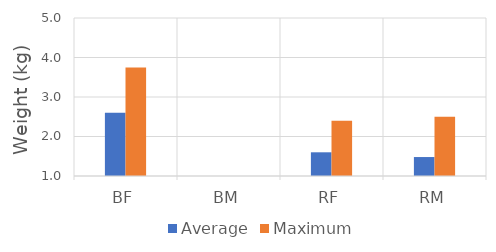
| Category | Average | Maximum |
|---|---|---|
| BF | 2.6 | 3.75 |
| BM | 0 | 0 |
| RF | 1.6 | 2.4 |
| RM | 1.48 | 2.5 |